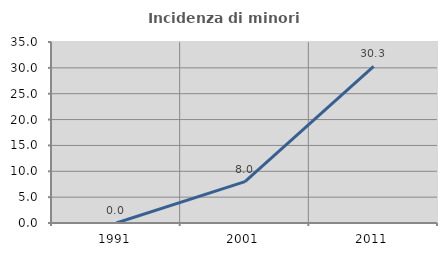
| Category | Incidenza di minori stranieri |
|---|---|
| 1991.0 | 0 |
| 2001.0 | 8 |
| 2011.0 | 30.303 |